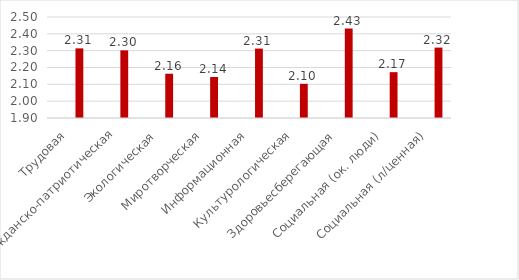
| Category | Series 0 | Series 1 | Series 2 |
|---|---|---|---|
| Трудовая |  |  | 2.314 |
| Гражданско-патриотическая |  |  | 2.302 |
| Экологическая |  |  | 2.163 |
| Миротворческая |  |  | 2.144 |
| Информационная |  |  | 2.312 |
| Культурологическая |  |  | 2.103 |
| Здоровьесберегающая |  |  | 2.431 |
| Социальная (ок. люди) |  |  | 2.172 |
| Социальная (л/ценная) |  |  | 2.318 |